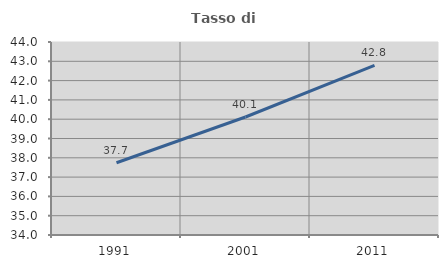
| Category | Tasso di occupazione   |
|---|---|
| 1991.0 | 37.745 |
| 2001.0 | 40.115 |
| 2011.0 | 42.784 |